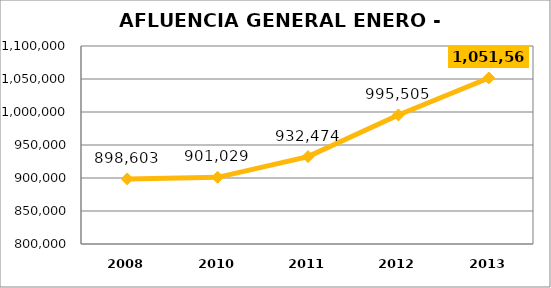
| Category | Series 0 |
|---|---|
| 2008.0 | 898603 |
| 2010.0 | 901029 |
| 2011.0 | 932474 |
| 2012.0 | 995505 |
| 2013.0 | 1051567 |